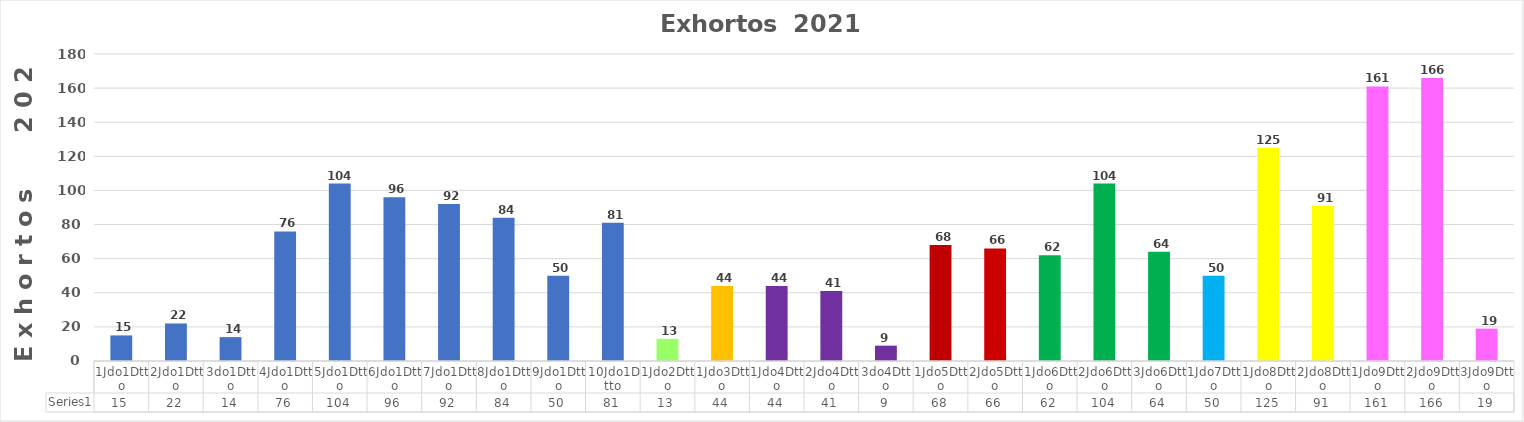
| Category | Series 0 |
|---|---|
| 1Jdo1Dtto | 15 |
| 2Jdo1Dtto | 22 |
| 3do1Dtto | 14 |
| 4Jdo1Dtto | 76 |
| 5Jdo1Dtto | 104 |
| 6Jdo1Dtto | 96 |
| 7Jdo1Dtto | 92 |
| 8Jdo1Dtto | 84 |
| 9Jdo1Dtto | 50 |
| 10Jdo1Dtto | 81 |
| 1Jdo2Dtto | 13 |
| 1Jdo3Dtto | 44 |
| 1Jdo4Dtto | 44 |
| 2Jdo4Dtto | 41 |
| 3do4Dtto | 9 |
| 1Jdo5Dtto | 68 |
| 2Jdo5Dtto | 66 |
| 1Jdo6Dtto | 62 |
| 2Jdo6Dtto | 104 |
| 3Jdo6Dtto | 64 |
| 1Jdo7Dtto | 50 |
| 1Jdo8Dtto | 125 |
| 2Jdo8Dtto | 91 |
| 1Jdo9Dtto | 161 |
| 2Jdo9Dtto | 166 |
| 3Jdo9Dtto | 19 |